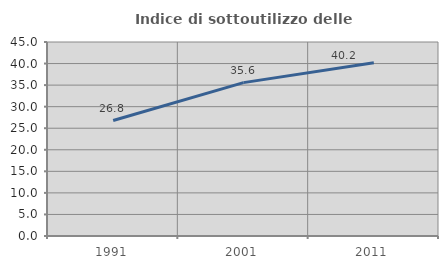
| Category | Indice di sottoutilizzo delle abitazioni  |
|---|---|
| 1991.0 | 26.781 |
| 2001.0 | 35.574 |
| 2011.0 | 40.174 |